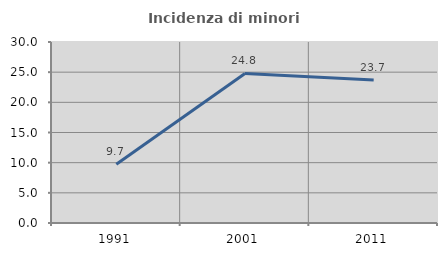
| Category | Incidenza di minori stranieri |
|---|---|
| 1991.0 | 9.722 |
| 2001.0 | 24.791 |
| 2011.0 | 23.71 |